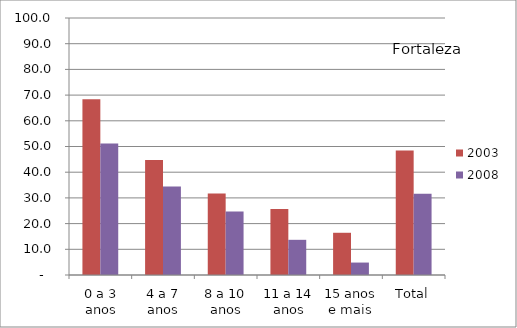
| Category | 2003 | 2008 |
|---|---|---|
| 0 a 3 anos | 68.35 | 51.21 |
| 4 a 7 anos | 44.72 | 34.47 |
| 8 a 10 anos | 31.7 | 24.69 |
| 11 a 14 anos | 25.71 | 13.69 |
| 15 anos e mais | 16.43 | 4.84 |
| Total | 48.47 | 31.58 |